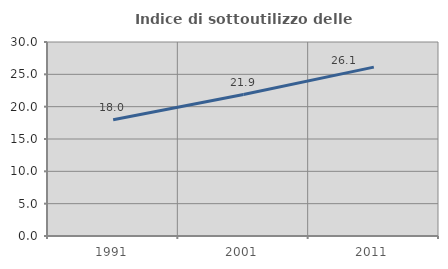
| Category | Indice di sottoutilizzo delle abitazioni  |
|---|---|
| 1991.0 | 17.983 |
| 2001.0 | 21.869 |
| 2011.0 | 26.11 |